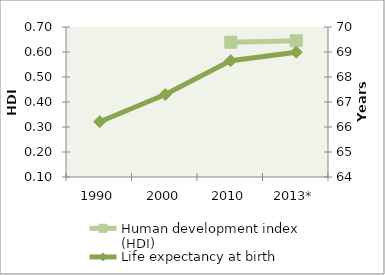
| Category | Human development index (HDI) |
|---|---|
| 1990 | 0 |
| 2000 | 0 |
| 2010 | 0.639 |
| 2013* | 0.645 |